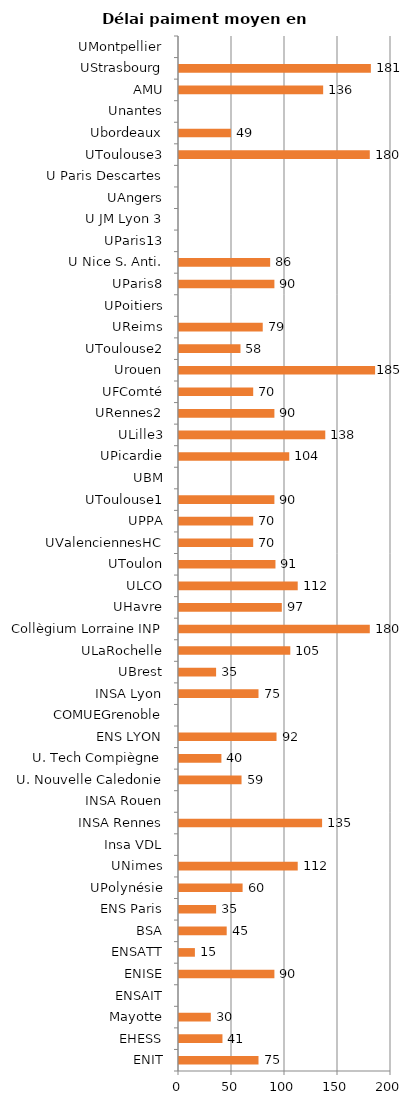
| Category | Délai paiment moyen en jours |
|---|---|
| ENIT | 75 |
| EHESS | 41 |
| Mayotte | 30 |
| ENSAIT | 0 |
| ENISE | 90 |
| ENSATT | 15 |
| BSA | 45 |
| ENS Paris | 35 |
| UPolynésie | 60 |
| UNimes | 112 |
| Insa VDL | 0 |
| INSA Rennes | 135 |
| INSA Rouen | 0 |
| U. Nouvelle Caledonie | 59 |
| U. Tech Compiègne | 40 |
| ENS LYON | 92 |
| COMUEGrenoble | 0 |
| INSA Lyon | 75 |
| UBrest | 35 |
| ULaRochelle | 105 |
| Collègium Lorraine INP | 180 |
| UHavre | 97 |
| ULCO | 112 |
| UToulon | 91 |
| UValenciennesHC | 70 |
| UPPA | 70 |
| UToulouse1 | 90 |
| UBM | 0 |
| UPicardie | 104 |
| ULille3 | 138 |
| URennes2 | 90 |
| UFComté | 70 |
| Urouen | 185 |
| UToulouse2 | 58 |
| UReims | 79 |
| UPoitiers | 0 |
| UParis8 | 90 |
| U Nice S. Anti. | 86 |
| UParis13 | 0 |
| U JM Lyon 3 | 0 |
| UAngers | 0 |
| U Paris Descartes | 0 |
| UToulouse3 | 180 |
| Ubordeaux | 49 |
| Unantes | 0 |
| AMU | 136 |
| UStrasbourg | 181 |
| UMontpellier | 0 |